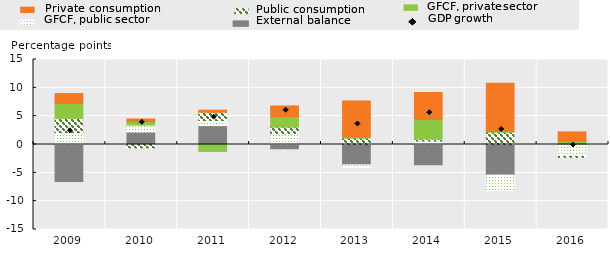
| Category | External balance | Gross fixed capital formation, public sector | Public consumption | Gross fixed capital formation, private sector | Private consumption |
|---|---|---|---|---|---|
| 2009.0 | -6.54 | 2.1 | 2.48 | 2.65 | 1.76 |
| 2010.0 | 2.19 | 1.23 | -0.6 | 0.62 | 0.46 |
| 2011.0 | 3.33 | 0.9 | 1.45 | -1.23 | 0.38 |
| 2012.0 | -0.75 | 1.89 | 1.16 | 1.87 | 1.88 |
| 2013.0 | -3.59 | -0.49 | 1.12 | 0.2 | 6.36 |
| 2014.0 | -3.57 | 0.62 | 0.31 | 3.5 | 4.75 |
| 2015.0 | -5.39 | -2.75 | 2.16 | 0.12 | 8.53 |
| 2016.0 | 0.07 | -2.1 | -0.21 | 0.52 | 1.63 |